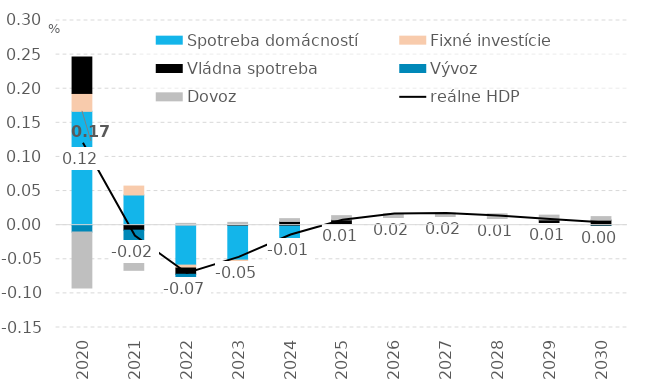
| Category | Spotreba domácností | Fixné investície | Vládna spotreba | Vývoz | Dovoz |
|---|---|---|---|---|---|
| 2020.0 | 0.167 | 0.026 | 0.053 | -0.01 | -0.082 |
| 2021.0 | 0.044 | 0.013 | -0.007 | -0.022 | -0.037 |
| 2022.0 | -0.059 | -0.004 | -0.009 | -0.014 | 0.003 |
| 2023.0 | -0.051 | -0.006 | 0.001 | -0.012 | 0.003 |
| 2024.0 | -0.028 | -0.004 | 0.005 | -0.006 | 0.004 |
| 2025.0 | -0.013 | -0.003 | 0.008 | -0.003 | 0.006 |
| 2026.0 | -0.006 | -0.002 | 0.009 | -0.003 | 0.008 |
| 2027.0 | -0.005 | -0.002 | 0.009 | -0.004 | 0.009 |
| 2028.0 | -0.006 | -0.002 | 0.008 | -0.006 | 0.008 |
| 2029.0 | -0.007 | -0.002 | 0.008 | -0.008 | 0.007 |
| 2030.0 | -0.008 | -0.002 | 0.007 | -0.01 | 0.005 |